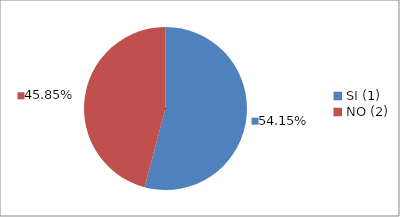
| Category | Series 0 |
|---|---|
| SI (1) | 0.542 |
| NO (2) | 0.458 |